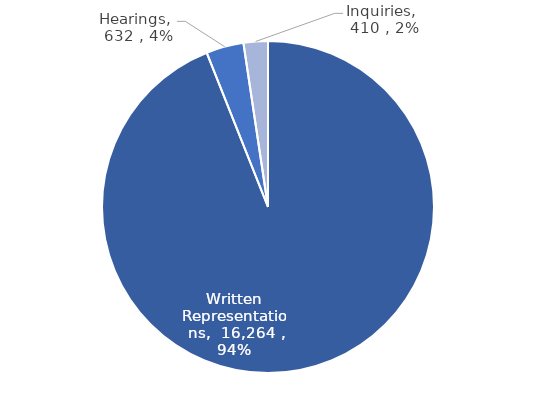
| Category | Series 0 |
|---|---|
| Written Representations | 16264 |
| Hearings | 632 |
| Inquiries | 410 |